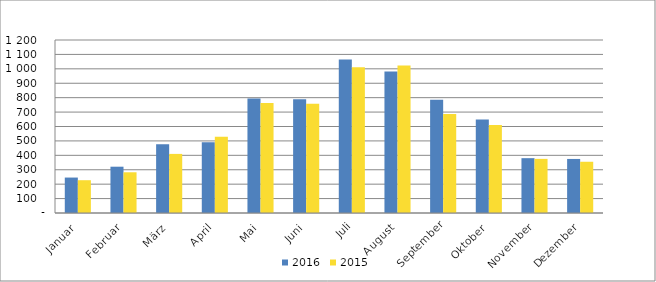
| Category | 2016 | 2015 |
|---|---|---|
| Januar | 245865 | 227436 |
| Februar | 321172 | 282437 |
| März | 476687 | 409915 |
| April | 490831 | 529705 |
| Mai | 793441 | 763430 |
| Juni | 788407 | 758053 |
| Juli | 1065529 | 1010376 |
| August | 982065 | 1023026 |
| September | 784786 | 686411 |
| Oktober | 648274 | 609720 |
| November | 380327 | 375409 |
| Dezember | 374908 | 355398 |